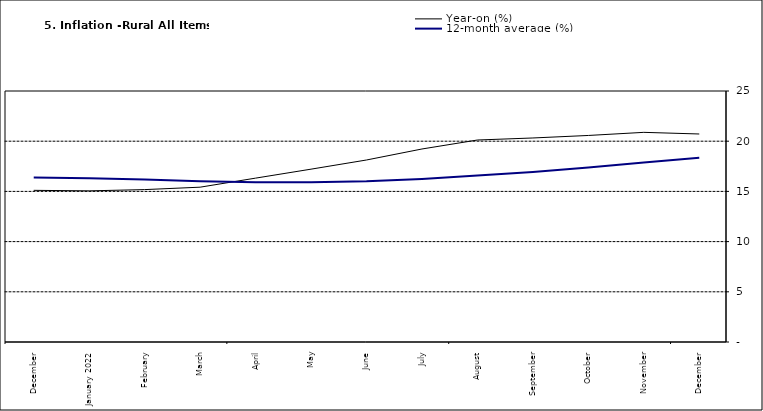
| Category | Year-on (%) | 12-month average (%) |
|---|---|---|
| December | 15.106 | 16.397 |
| January 2022 | 15.055 | 16.313 |
| February | 15.179 | 16.176 |
| March | 15.421 | 15.999 |
| April | 16.321 | 15.908 |
| May | 17.215 | 15.915 |
| June | 18.128 | 16.017 |
| July | 19.224 | 16.246 |
| August | 20.118 | 16.575 |
| September | 20.322 | 16.944 |
| October | 20.572 | 17.376 |
| November | 20.882 | 17.876 |
| December | 20.718 | 18.342 |